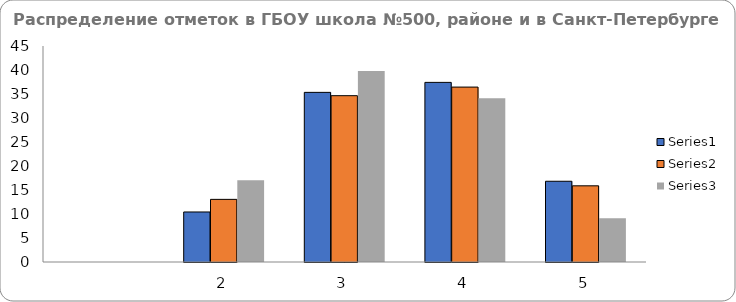
| Category | Series 0 | Series 1 | Series 2 |
|---|---|---|---|
| nan | 0 | 0 | 0 |
| 2.0 | 10.42 | 13.05 | 17.05 |
| 3.0 | 35.34 | 34.65 | 39.77 |
| 4.0 | 37.42 | 36.44 | 34.09 |
| 5.0 | 16.82 | 15.87 | 9.09 |